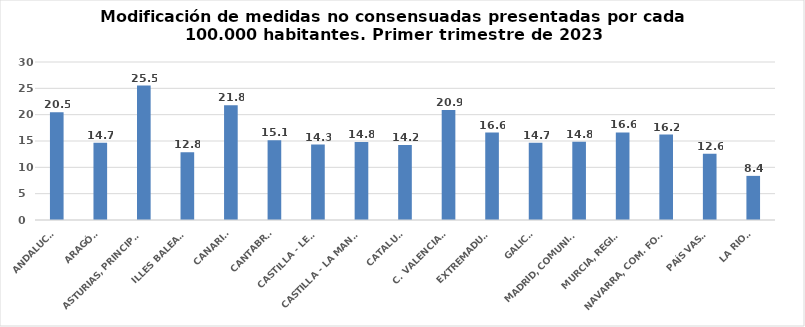
| Category | Series 0 |
|---|---|
| ANDALUCÍA | 20.48 |
| ARAGÓN | 14.674 |
| ASTURIAS, PRINCIPADO | 25.531 |
| ILLES BALEARS | 12.845 |
| CANARIAS | 21.781 |
| CANTABRIA | 15.122 |
| CASTILLA - LEÓN | 14.312 |
| CASTILLA - LA MANCHA | 14.803 |
| CATALUÑA | 14.242 |
| C. VALENCIANA | 20.907 |
| EXTREMADURA | 16.599 |
| GALICIA | 14.668 |
| MADRID, COMUNIDAD | 14.834 |
| MURCIA, REGIÓN | 16.616 |
| NAVARRA, COM. FORAL | 16.215 |
| PAÍS VASCO | 12.568 |
| LA RIOJA | 8.378 |